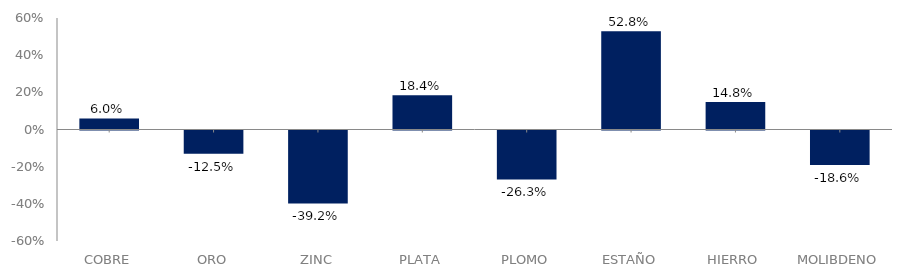
| Category | Series 0 |
|---|---|
| COBRE | 0.06 |
| ORO | -0.125 |
| ZINC | -0.392 |
| PLATA | 0.184 |
| PLOMO | -0.263 |
| ESTAÑO | 0.528 |
| HIERRO | 0.148 |
| MOLIBDENO | -0.186 |